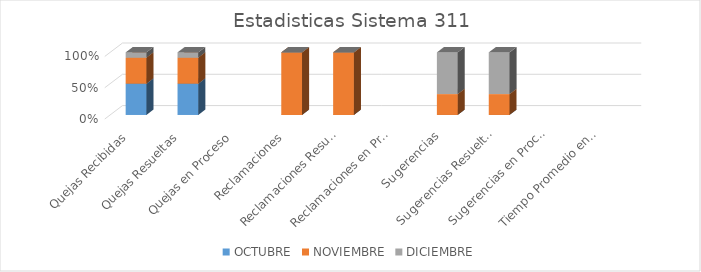
| Category | OCTUBRE | NOVIEMBRE | DICIEMBRE |
|---|---|---|---|
| Quejas Recibidas | 6 | 5 | 1 |
| Quejas Resueltas | 6 | 5 | 1 |
| Quejas en Proceso | 0 | 0 | 0 |
| Reclamaciones | 0 | 2 | 0 |
| Reclamaciones Resueltas | 0 | 2 | 0 |
| Reclamaciones en Proceso | 0 | 0 | 0 |
| Sugerencias | 0 | 1 | 2 |
| Sugerencias Resueltas | 0 | 1 | 2 |
| Sugerencias en Proceso | 0 | 0 | 0 |
| Tiempo Promedio en que fueron Respondidas | 0 | 0 | 0 |